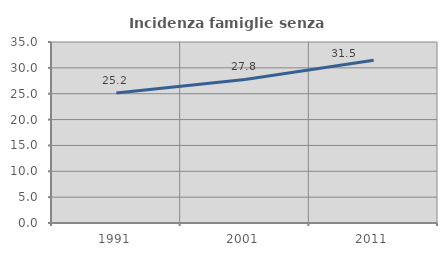
| Category | Incidenza famiglie senza nuclei |
|---|---|
| 1991.0 | 25.153 |
| 2001.0 | 27.763 |
| 2011.0 | 31.49 |